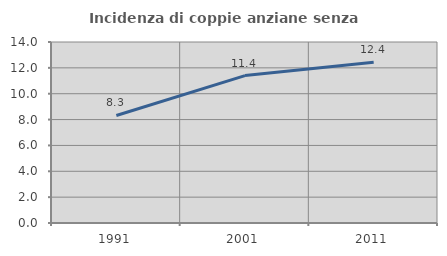
| Category | Incidenza di coppie anziane senza figli  |
|---|---|
| 1991.0 | 8.319 |
| 2001.0 | 11.404 |
| 2011.0 | 12.443 |